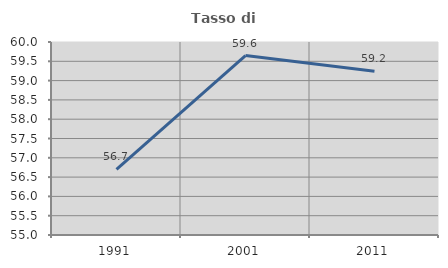
| Category | Tasso di occupazione   |
|---|---|
| 1991.0 | 56.7 |
| 2001.0 | 59.649 |
| 2011.0 | 59.24 |